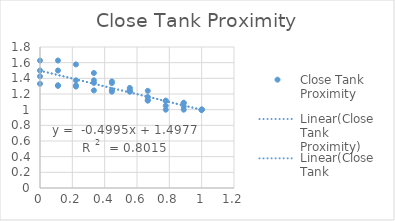
| Category | Close Tank Proximity |
|---|---|
| 1.0 | 1 |
| 0.8888888888888888 | 1 |
| 0.7777777777777778 | 1 |
| 0.6666666666666666 | 1.125 |
| 0.5555555555555556 | 1.25 |
| 0.4444444444444444 | 1.25 |
| 0.3333333333333333 | 1.375 |
| 0.2222222222222222 | 1.375 |
| 0.1111111111111111 | 1.5 |
| 0.0 | 1.5 |
| 1.0 | 1 |
| 0.8888888888888888 | 1.082 |
| 0.7777777777777778 | 1.115 |
| 0.6666666666666666 | 1.115 |
| 0.5555555555555556 | 1.23 |
| 0.4444444444444444 | 1.23 |
| 0.3333333333333333 | 1.246 |
| 0.2222222222222222 | 1.295 |
| 0.1111111111111111 | 1.311 |
| 0.0 | 1.426 |
| 1.0 | 1 |
| 0.8888888888888888 | 1.089 |
| 0.7777777777777778 | 1.05 |
| 0.6666666666666666 | 1.24 |
| 0.5555555555555556 | 1.277 |
| 0.4444444444444444 | 1.361 |
| 0.3333333333333333 | 1.341 |
| 0.2222222222222222 | 1.31 |
| 0.1111111111111111 | 1.304 |
| 0.0 | 1.33 |
| 1.0 | 1 |
| 0.8888888888888888 | 1.04 |
| 0.7777777777777778 | 1.113 |
| 0.6666666666666666 | 1.162 |
| 0.5555555555555556 | 1.236 |
| 0.4444444444444444 | 1.34 |
| 0.3333333333333333 | 1.468 |
| 0.2222222222222222 | 1.578 |
| 0.1111111111111111 | 1.627 |
| 0.0 | 1.627 |